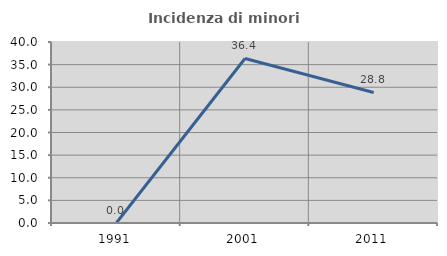
| Category | Incidenza di minori stranieri |
|---|---|
| 1991.0 | 0 |
| 2001.0 | 36.364 |
| 2011.0 | 28.846 |